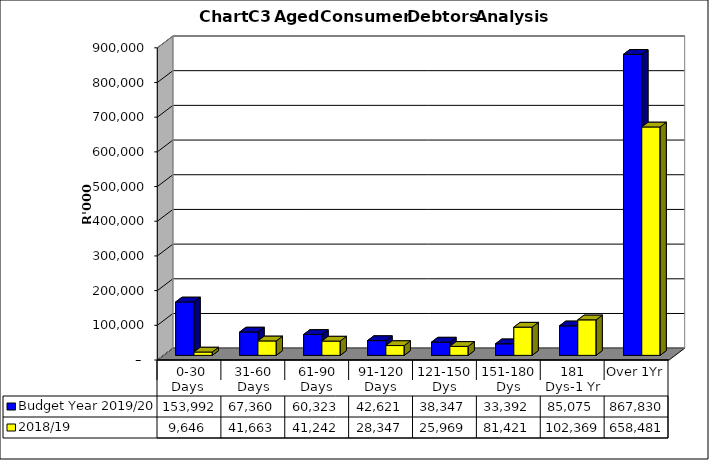
| Category | Budget Year 2019/20 | 2018/19 |
|---|---|---|
|  0-30 Days  | 153992483 | 9645963.2 |
| 31-60 Days | 67359647 | 41662674.38 |
| 61-90 Days | 60323221 | 41242377.06 |
| 91-120 Days | 42621097 | 28346868.86 |
| 121-150 Dys | 38346834 | 25969372.26 |
| 151-180 Dys | 33392196 | 81421303.19 |
| 181 Dys-1 Yr | 85075134 | 102369484.76 |
| Over 1Yr | 867830253 | 658480918.98 |